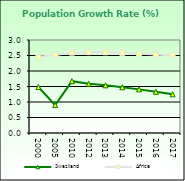
| Category | Swaziland | Africa  |
|---|---|---|
| 2000.0 | 1.485 | 2.458 |
| 2005.0 | 0.901 | 2.516 |
| 2010.0 | 1.672 | 2.59 |
| 2012.0 | 1.587 | 2.606 |
| 2013.0 | 1.538 | 2.601 |
| 2014.0 | 1.477 | 2.584 |
| 2015.0 | 1.407 | 2.559 |
| 2016.0 | 1.328 | 2.531 |
| 2017.0 | 1.249 | 2.503 |